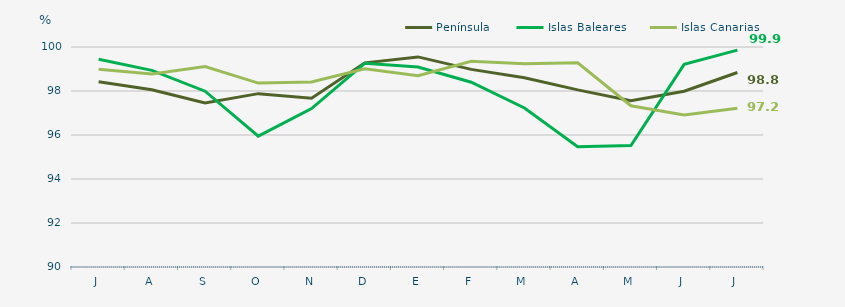
| Category | Península | Islas Baleares | Islas Canarias |
|---|---|---|---|
| J | 98.42 | 99.44 | 98.99 |
| A | 98.06 | 98.94 | 98.77 |
| S | 97.46 | 97.99 | 99.11 |
| O | 97.88 | 95.95 | 98.36 |
| N | 97.67 | 97.2 | 98.41 |
| D | 99.28 | 99.26 | 99.01 |
| E | 99.55 | 99.09 | 98.69 |
| F | 98.984 | 98.4 | 99.35 |
| M | 98.6 | 97.23 | 99.24 |
| A | 98.05 | 95.47 | 99.28 |
| M | 97.56 | 95.52 | 97.33 |
| J | 97.99 | 99.21 | 96.91 |
| J | 98.84 | 99.86 | 97.22 |